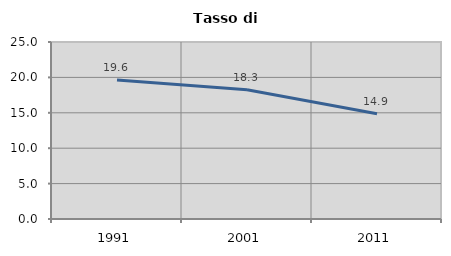
| Category | Tasso di disoccupazione   |
|---|---|
| 1991.0 | 19.635 |
| 2001.0 | 18.255 |
| 2011.0 | 14.88 |